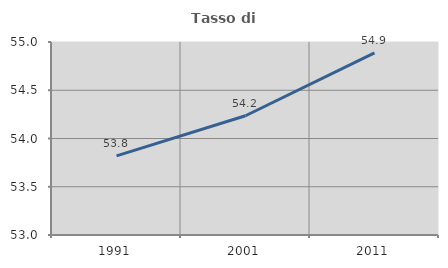
| Category | Tasso di occupazione   |
|---|---|
| 1991.0 | 53.819 |
| 2001.0 | 54.236 |
| 2011.0 | 54.887 |